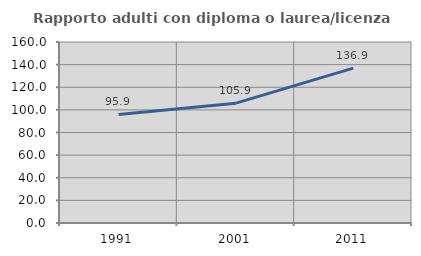
| Category | Rapporto adulti con diploma o laurea/licenza media  |
|---|---|
| 1991.0 | 95.912 |
| 2001.0 | 105.94 |
| 2011.0 | 136.937 |